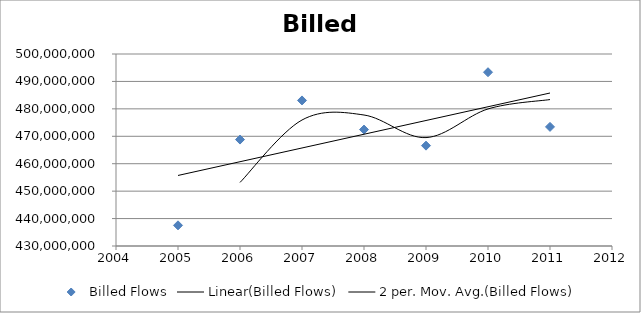
| Category | Billed Flows |
|---|---|
| 2005.0 | 437536300 |
| 2006.0 | 468801900 |
| 2007.0 | 483071500 |
| 2008.0 | 472449300 |
| 2009.0 | 466589000 |
| 2010.0 | 493353300 |
| 2011.0 | 473427400 |